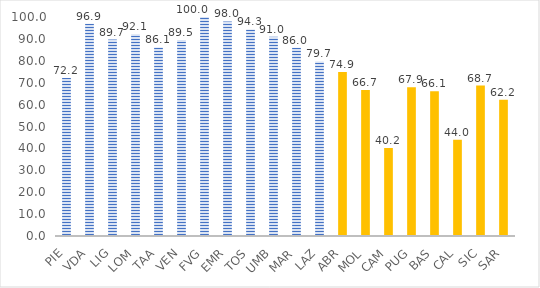
| Category | nidi e sezioni primavera |
|---|---|
| PIE | 72.2 |
| VDA | 96.9 |
| LIG | 89.7 |
| LOM | 92.1 |
| TAA | 86.1 |
| VEN | 89.5 |
| FVG | 100 |
| EMR | 98 |
| TOS | 94.3 |
| UMB | 91 |
| MAR | 86 |
| LAZ | 79.7 |
| ABR | 74.9 |
| MOL | 66.7 |
| CAM | 40.2 |
| PUG | 67.9 |
| BAS | 66.1 |
| CAL | 44 |
| SIC | 68.7 |
| SAR | 62.2 |